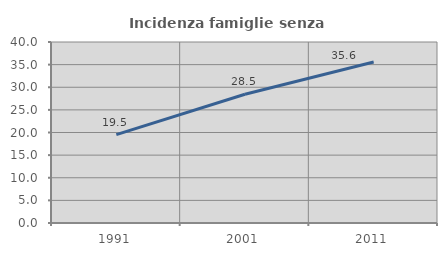
| Category | Incidenza famiglie senza nuclei |
|---|---|
| 1991.0 | 19.518 |
| 2001.0 | 28.464 |
| 2011.0 | 35.572 |